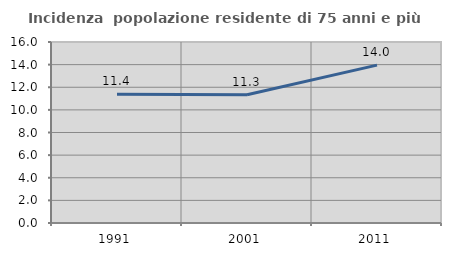
| Category | Incidenza  popolazione residente di 75 anni e più |
|---|---|
| 1991.0 | 11.388 |
| 2001.0 | 11.343 |
| 2011.0 | 13.953 |